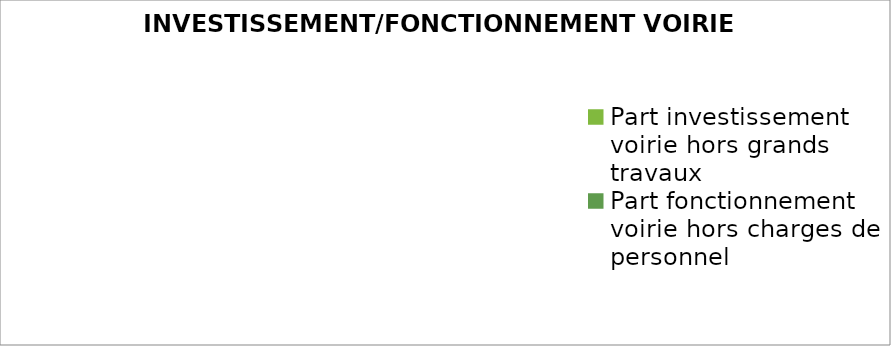
| Category | Series 0 |
|---|---|
| Part investissement voirie hors grands travaux | 0 |
| Part fonctionnement voirie hors charges de personnel | 0 |